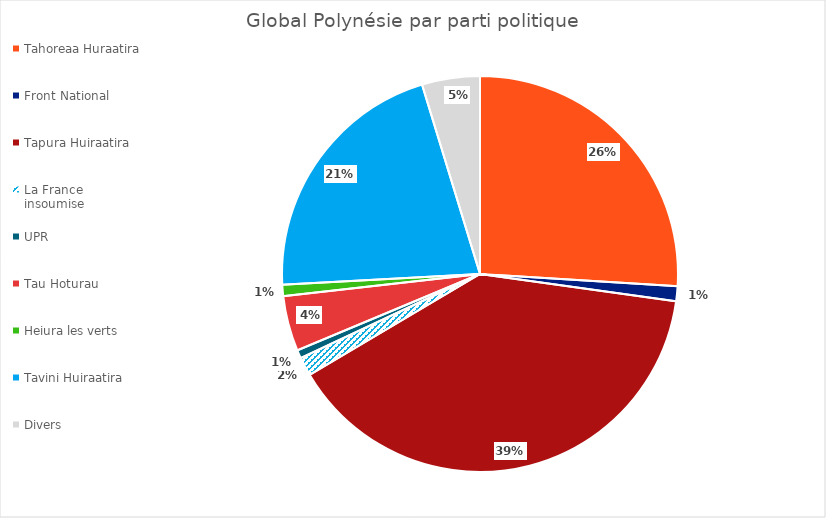
| Category | Global Polynésie |
|---|---|
| Tahoreaa Huraatira | 21760 |
| Front National | 1021 |
| Tapura Huiraatira | 32904 |
| La France insoumise | 1277 |
| UPR | 567 |
| Tau Hoturau | 3777 |
| Heiura les verts | 778 |
| Tavini Huiraatira | 17696 |
| Divers | 3958 |